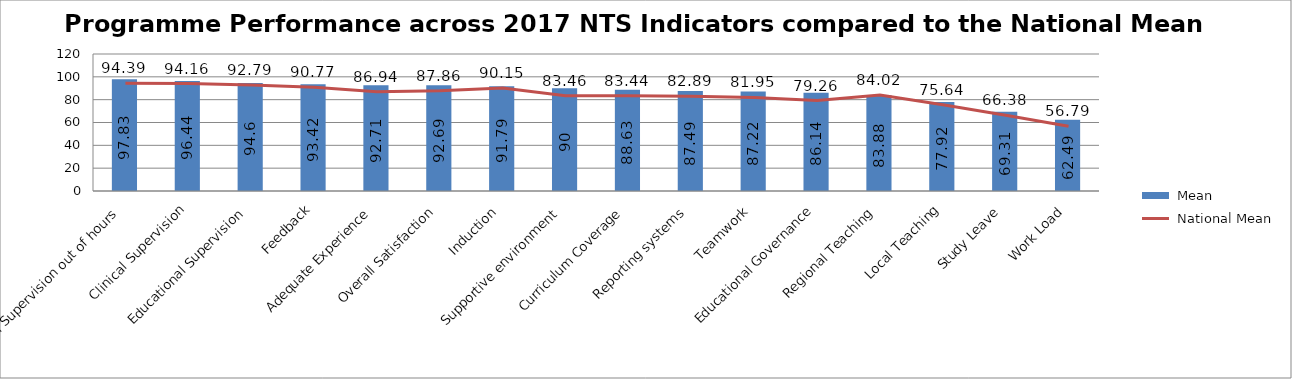
| Category |  Mean |
|---|---|
| Clinical Supervision out of hours | 97.83 |
| Clinical Supervision | 96.44 |
| Educational Supervision | 94.6 |
| Feedback | 93.42 |
| Adequate Experience | 92.71 |
| Overall Satisfaction | 92.69 |
| Induction | 91.79 |
| Supportive environment | 90 |
| Curriculum Coverage | 88.63 |
| Reporting systems | 87.49 |
| Teamwork | 87.22 |
| Educational Governance | 86.14 |
| Regional Teaching | 83.88 |
| Local Teaching | 77.92 |
| Study Leave | 69.31 |
| Work Load | 62.49 |